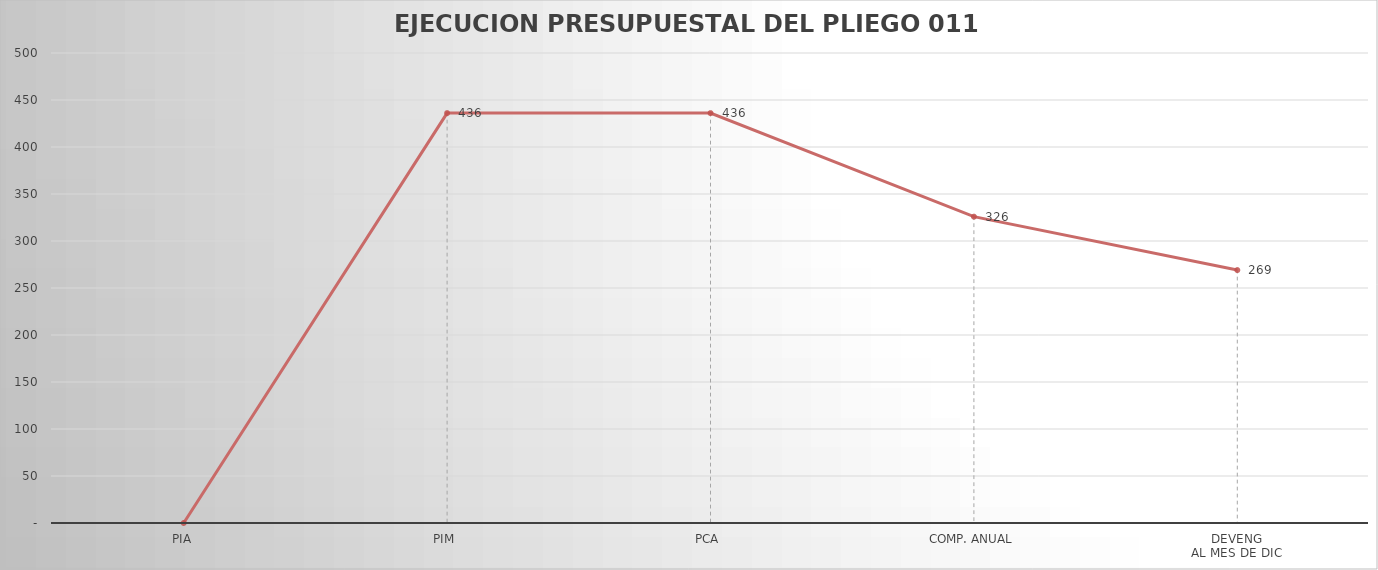
| Category | Series 0 |
|---|---|
| PIA | 0 |
| PIM | 436.059 |
| PCA | 436.059 |
| COMP. ANUAL | 325.875 |
| DEVENG
AL MES DE DIC | 269.069 |